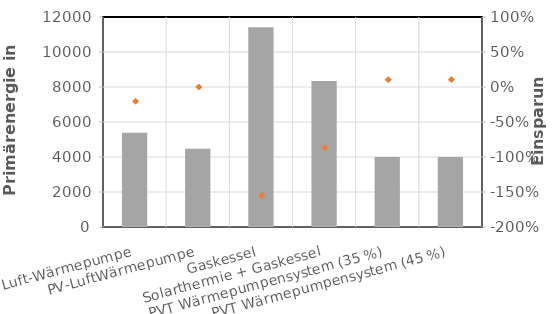
| Category | Primärenergie-verbrauch |
|---|---|
| Luft-Wärmepumpe | 5387.4 |
| PV-LuftWärmepumpe | 4474.8 |
| Gaskessel | 11408.67 |
| Solarthermie + Gaskessel | 8342.15 |
| PVT Wärmepumpensystem (35 %) | 4003.92 |
| PVT Wärmepumpensystem (45 %) | 4003.92 |